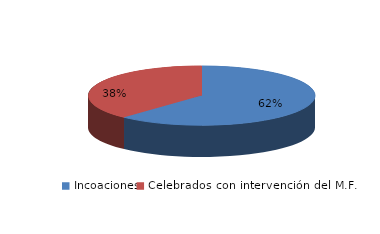
| Category | Series 0 |
|---|---|
| Incoaciones | 2996 |
| Celebrados con intervención del M.F. | 1842 |